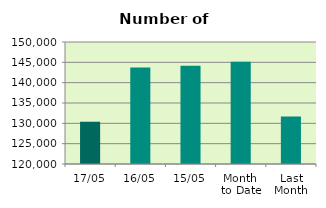
| Category | Series 0 |
|---|---|
| 17/05 | 130378 |
| 16/05 | 143710 |
| 15/05 | 144180 |
| Month 
to Date | 145168.667 |
| Last
Month | 131708.5 |